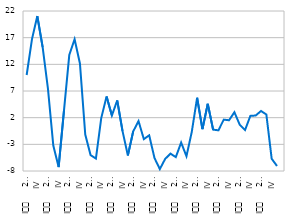
| Category | Период | Годишњи раст цена непокретности (%) |
|---|---|---|
| II
     2008. |  | 10.003 |
| III |  | 16.731 |
| IV |  | 21.051 |
| I
2009. |  | 15.225 |
| II
     2009. |  | 7.382 |
| III |  | -3.239 |
| IV
 |  | -7.272 |
| I
2010. |  | 3.265 |
| II
     2010. |  | 13.741 |
| III |  | 16.702 |
| IV |  | 12.159 |
| I
2011. |  | -1.151 |
| II
     2011. |  | -5.01 |
| III |  | -5.661 |
| IV |  | 1.922 |
| I
2012. |  | 5.976 |
| II
     2012. |  | 2.405 |
| III |  | 5.231 |
| IV |  | -0.519 |
| I
2013. |  | -5.083 |
| II
     2013. |  | -0.581 |
| III |  | 1.362 |
| IV |  | -2.027 |
| I
2014. |  | -1.304 |
| II
     2014. |  | -5.572 |
| III |  | -7.641 |
| IV |  | -5.739 |
| I
2015. |  | -4.743 |
| II
     2015. |  | -5.396 |
| III |  | -2.67 |
| IV |  | -5.226 |
|  |  | -0.657 |
| II
     2016. |  | 5.734 |
| III |  | -0.155 |
| IV |  | 4.606 |
| I
2017. |  | -0.243 |
| II
     2017. |  | -0.373 |
| III |  | 1.631 |
| IV |  | 1.513 |
| I
2018. |  | 3.024 |
| II
     2018. |  | 0.684 |
| III |  | -0.325 |
| IV |  | 2.337 |
| I
2019. |  | 2.405 |
| II
     2019. |  | 3.257 |
| III |  | 2.597 |
| IV |  | -5.704 |